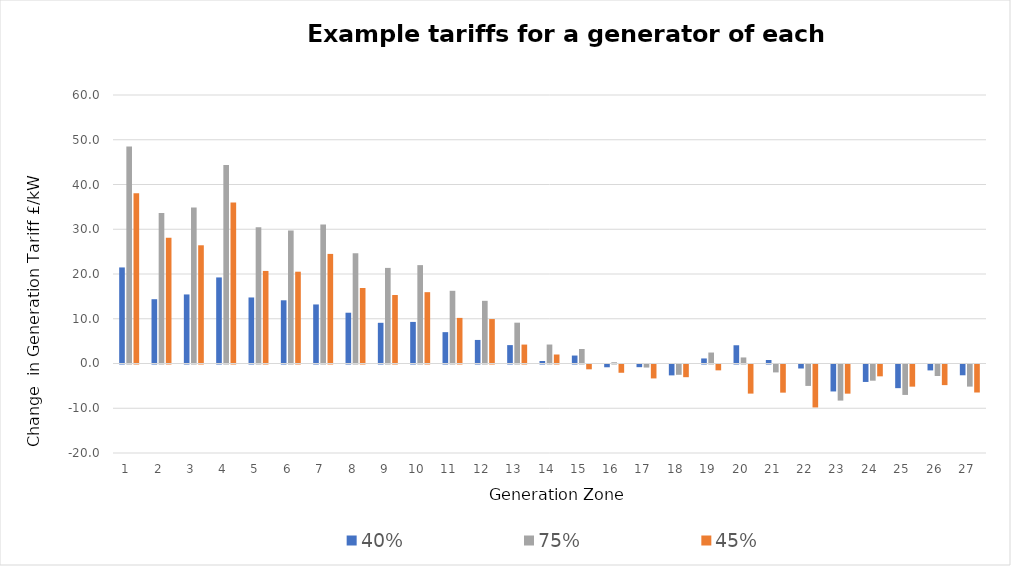
| Category | 40% | 75% | 45% |
|---|---|---|---|
| 1.0 | 21.466 | 48.466 | 38.064 |
| 2.0 | 14.368 | 33.617 | 28.099 |
| 3.0 | 15.43 | 34.847 | 26.417 |
| 4.0 | 19.232 | 44.369 | 35.951 |
| 5.0 | 14.756 | 30.47 | 20.685 |
| 6.0 | 14.123 | 29.729 | 20.514 |
| 7.0 | 13.194 | 31.055 | 24.489 |
| 8.0 | 11.347 | 24.636 | 16.871 |
| 9.0 | 9.094 | 21.362 | 15.302 |
| 10.0 | 9.292 | 21.983 | 15.94 |
| 11.0 | 7.005 | 16.246 | 10.191 |
| 12.0 | 5.266 | 14.007 | 9.931 |
| 13.0 | 4.109 | 9.122 | 4.229 |
| 14.0 | 0.56 | 4.242 | 2.011 |
| 15.0 | 1.778 | 3.244 | -1.077 |
| 16.0 | -0.62 | 0.279 | -1.848 |
| 17.0 | -0.598 | -0.682 | -3.111 |
| 18.0 | -2.433 | -2.302 | -2.836 |
| 19.0 | 1.13 | 2.451 | -1.306 |
| 20.0 | 4.076 | 1.353 | -6.505 |
| 21.0 | 0.788 | -1.767 | -6.289 |
| 22.0 | -0.894 | -4.787 | -9.598 |
| 23.0 | -6.023 | -8.066 | -6.516 |
| 24.0 | -3.9 | -3.621 | -2.645 |
| 25.0 | -5.286 | -6.801 | -4.951 |
| 26.0 | -1.318 | -2.564 | -4.606 |
| 27.0 | -2.409 | -4.941 | -6.258 |